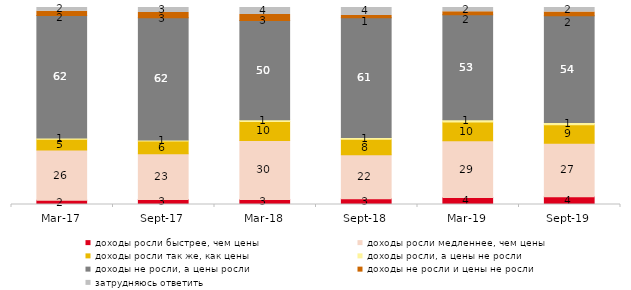
| Category | доходы росли быстрее, чем цены | доходы росли медленнее, чем цены | доходы росли так же, как цены | доходы росли, а цены не росли | доходы не росли, а цены росли | доходы не росли и цены не росли | затрудняюсь ответить |
|---|---|---|---|---|---|---|---|
| 2017-03-01 | 2.1 | 25.6 | 5.45 | 0.65 | 62.1 | 2.2 | 1.9 |
| 2017-09-01 | 2.55 | 23.2 | 6.45 | 0.5 | 62.1 | 2.7 | 2.5 |
| 2018-03-01 | 2.6 | 29.9 | 9.65 | 0.9 | 50.4 | 3 | 3.55 |
| 2018-09-01 | 2.9 | 22.3 | 7.95 | 0.9 | 60.8 | 1.15 | 4 |
| 2019-03-01 | 3.58 | 28.792 | 9.547 | 1.044 | 53.357 | 1.542 | 2.138 |
| 2019-09-01 | 3.911 | 27.228 | 9.356 | 1.139 | 54.208 | 1.931 | 2.228 |